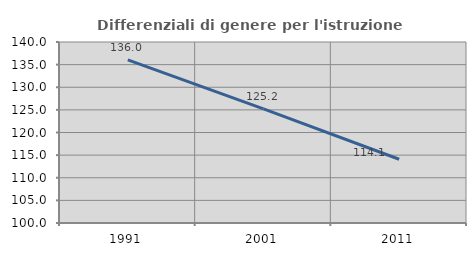
| Category | Differenziali di genere per l'istruzione superiore |
|---|---|
| 1991.0 | 136.044 |
| 2001.0 | 125.214 |
| 2011.0 | 114.086 |